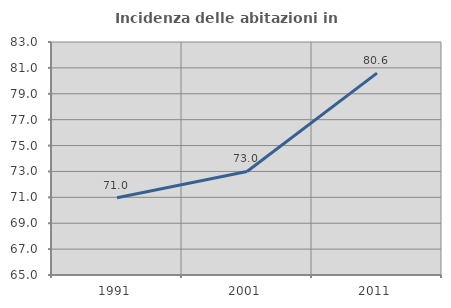
| Category | Incidenza delle abitazioni in proprietà  |
|---|---|
| 1991.0 | 70.974 |
| 2001.0 | 73 |
| 2011.0 | 80.597 |